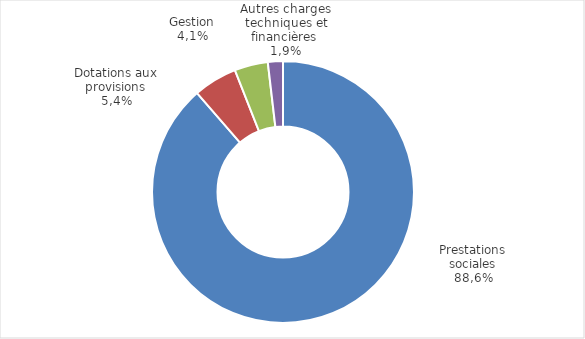
| Category | Series 0 |
|---|---|
| Prestations sociales | 13727.218 |
| Dotations aux provisions | 836.783 |
| Gestion | 639.164 |
| Autres charges techniques et financières* | 287.659 |